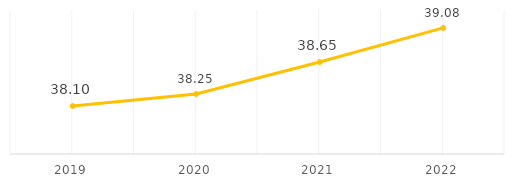
| Category | 38.10 |
|---|---|
| 2019.0 | 38.099 |
| 2020.0 | 38.249 |
| 2021.0 | 38.649 |
| 2022.0 | 39.076 |